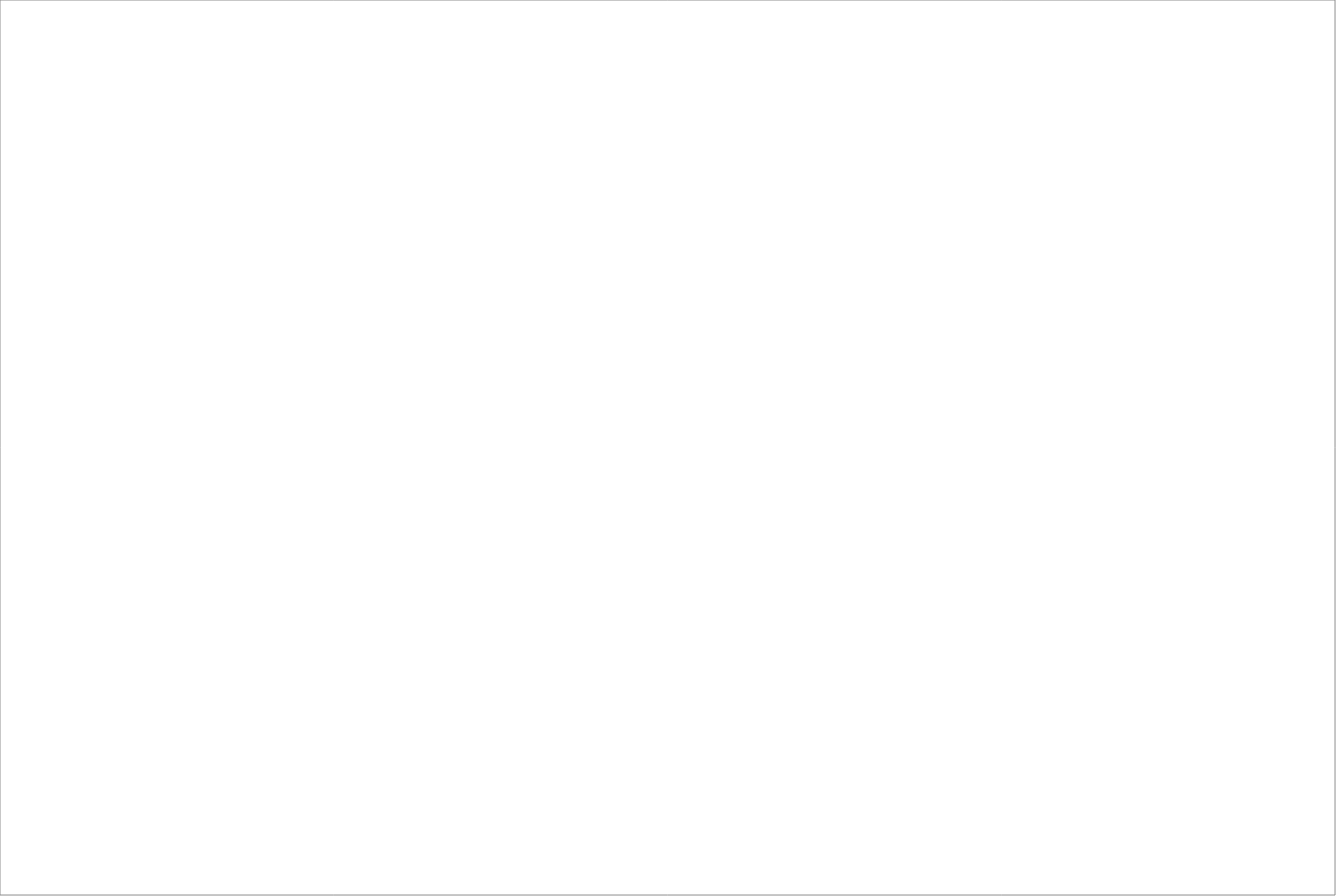
| Category | Total |
|---|---|
| Randstad AB | 77.35 |
| Poolia Sverige AB | 65 |
| StudentConsulting Sweden AB | 65 |
| Clockwork Bemanning & Rekrytering AB | 64.5 |
| Academic Work Sweden AB  | 62.5 |